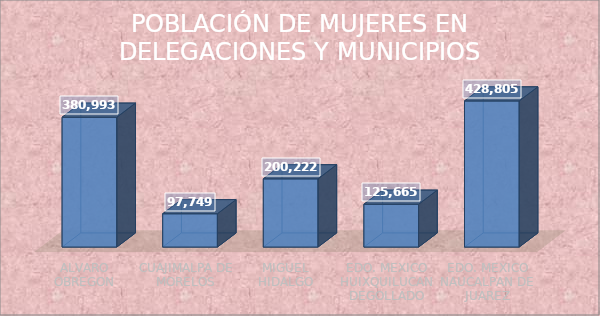
| Category | POBLACIÓN DE MUJERES |
|---|---|
| ALVARO OBREGON | 380993 |
| CUAJIMALPA DE MORELOS | 97749 |
| MIGUEL HIDALGO | 200222 |
| EDO. MEXICO HUIXQUILUCAN DEGOLLADO | 125665 |
| EDO. MEXICO NAUCALPAN DE JUAREZ | 428805 |